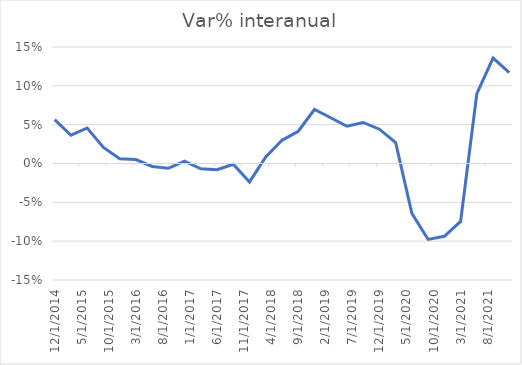
| Category | Series 0 |
|---|---|
| 12/20/14 | 0.057 |
| 3/20/15 | 0.036 |
| 6/18/15 | 0.046 |
| 9/16/15 | 0.021 |
| 12/15/15 | 0.006 |
| 3/14/16 | 0.005 |
| 6/12/16 | -0.004 |
| 9/10/16 | -0.006 |
| 12/9/16 | 0.003 |
| 3/9/17 | -0.007 |
| 6/7/17 | -0.008 |
| 9/5/17 | -0.001 |
| 12/4/17 | -0.024 |
| 3/30/18 | 0.008 |
| 6/28/18 | 0.03 |
| 9/26/18 | 0.041 |
| 12/25/18 | 0.07 |
| 3/25/19 | 0.059 |
| 6/23/19 | 0.048 |
| 9/21/19 | 0.053 |
| 12/20/19 | 0.044 |
| 3/19/20 | 0.027 |
| 6/17/20 | -0.064 |
| 9/15/20 | -0.098 |
| 12/14/20 | -0.094 |
| 3/14/21 | -0.075 |
| 6/12/21 | 0.09 |
| 9/10/21 | 0.136 |
| 12/9/21 | 0.117 |